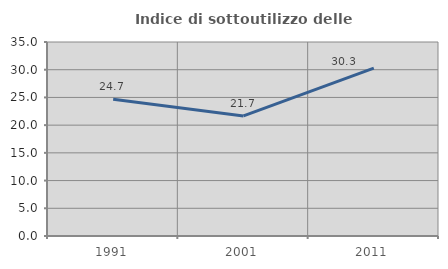
| Category | Indice di sottoutilizzo delle abitazioni  |
|---|---|
| 1991.0 | 24.667 |
| 2001.0 | 21.667 |
| 2011.0 | 30.303 |